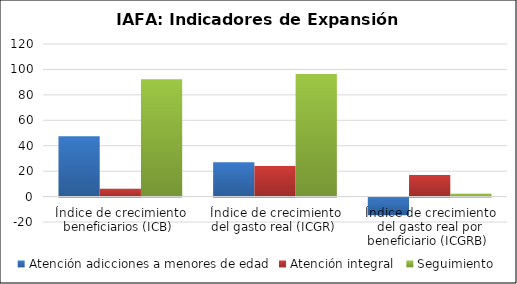
| Category | Atención adicciones a menores de edad | Atención integral  | Seguimiento |
|---|---|---|---|
| Índice de crecimiento beneficiarios (ICB)  | 47.436 | 6.173 | 92 |
| Índice de crecimiento del gasto real (ICGR)  | 27.075 | 24.083 | 96.348 |
| Índice de crecimiento del gasto real por beneficiario (ICGRB)  | -13.81 | 16.869 | 2.265 |